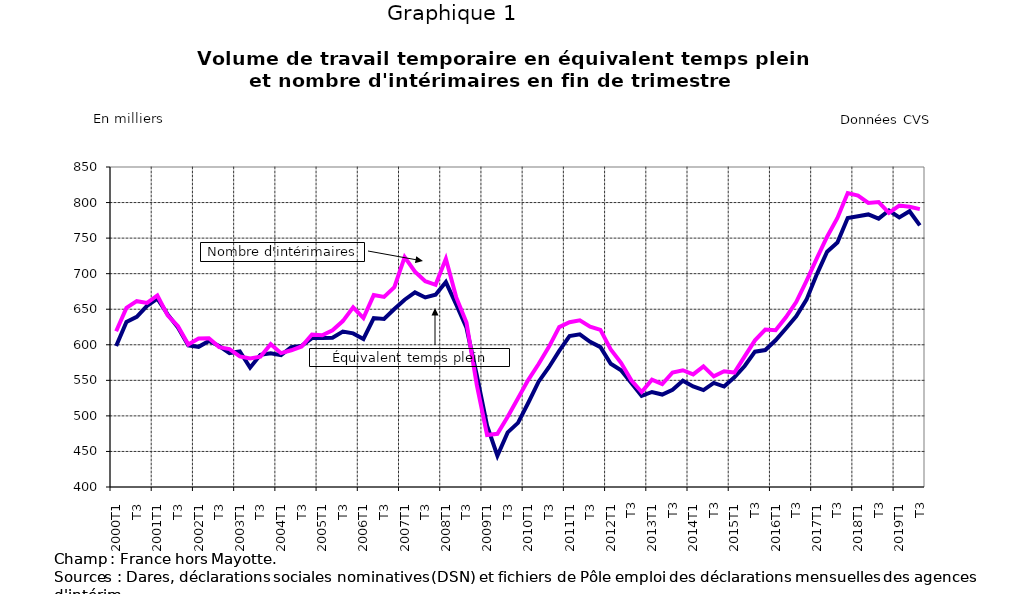
| Category | eetp | cec |
|---|---|---|
| 2000T1 | 598.382 | 619.098 |
|      T2 | 632.059 | 651.884 |
|      T3 | 639.374 | 661.327 |
|      T4 | 654.787 | 658.931 |
| 2001T1 | 664.911 | 669.328 |
|      T2 | 642.767 | 641.391 |
|      T3 | 624.178 | 626.182 |
|      T4 | 598.983 | 600.477 |
| 2002T1 | 597.102 | 608.86 |
|      T2 | 605.4 | 609.181 |
|      T3 | 598.189 | 596.727 |
|      T4 | 588.383 | 593.91 |
| 2003T1 | 590.633 | 583.666 |
|      T2 | 567.816 | 580.831 |
|      T3 | 585.881 | 583.192 |
|      T4 | 588.014 | 600.822 |
| 2004T1 | 585.427 | 588.237 |
|      T2 | 596.637 | 592.277 |
|      T3 | 598.394 | 597.649 |
|      T4 | 609.452 | 614.456 |
| 2005T1 | 609.689 | 613.352 |
|      T2 | 609.992 | 620.471 |
|      T3 | 618.606 | 633.285 |
|      T4 | 616.033 | 652.685 |
| 2006T1 | 608.261 | 637.528 |
|      T2 | 637.517 | 669.9 |
|      T3 | 636.243 | 667.375 |
|      T4 | 650.257 | 680.955 |
| 2007T1 | 663.408 | 723.243 |
|      T2 | 673.704 | 702.92 |
|      T3 | 666.56 | 689.387 |
|      T4 | 670.484 | 684.335 |
| 2008T1 | 688.199 | 720.841 |
|      T2 | 656.692 | 667.003 |
|      T3 | 624.003 | 631.418 |
|      T4 | 557.186 | 543.562 |
| 2009T1 | 486.11 | 473.126 |
|      T2 | 444.015 | 474.836 |
|      T3 | 476.776 | 498.779 |
|      T4 | 490.172 | 524.879 |
| 2010T1 | 518.426 | 550.759 |
|      T2 | 548.063 | 572.962 |
|      T3 | 568.467 | 597.099 |
|      T4 | 591.312 | 624.844 |
| 2011T1 | 612.236 | 631.746 |
|      T2 | 614.749 | 634.508 |
|      T3 | 604.141 | 625.566 |
|      T4 | 596.732 | 620.942 |
| 2012T1 | 573.292 | 593.522 |
|      T2 | 564.143 | 574.723 |
| T3 | 546.447 | 550.014 |
| T4 | 528.044 | 533.565 |
| 2013T1 | 533.609 | 551.009 |
| T2 | 529.997 | 544.575 |
| T3 | 536.802 | 561.084 |
| T4 | 549.375 | 564.16 |
| 2014T1 | 541.34 | 558.324 |
| T2 | 536.248 | 569.698 |
| T3 | 546.377 | 555.609 |
| T4 | 541.209 | 562.749 |
| 2015T1 | 554.318 | 560.98 |
| T2 | 570.164 | 583.613 |
| T3 | 590.307 | 606.236 |
| T4 | 592.606 | 621.314 |
| 2016T1 | 606.374 | 620.561 |
| T2 | 622.904 | 638.601 |
| T3 | 640.075 | 660.087 |
| T4 | 663.443 | 689.927 |
| 2017T1 | 699.039 | 721.426 |
| T2 | 730.823 | 751.922 |
| T3 | 743.882 | 778.312 |
| T4 | 778.229 | 813.372 |
| 2018T1 | 780.617 | 809.664 |
| T2 | 783.293 | 799.487 |
| T3 | 777.384 | 800.623 |
| T4 | 788.794 | 785.624 |
| 2019T1 | 779.039 | 795.703 |
| T2 | 787.796 | 793.979 |
| T3 | 767.928 | 790.732 |